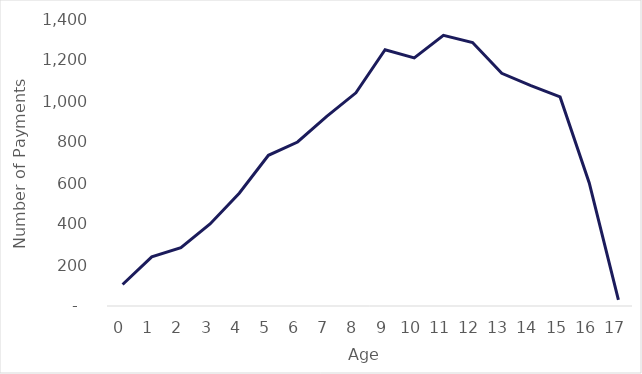
| Category | Number of Payments |
|---|---|
| 0.0 | 105 |
| 1.0 | 240 |
| 2.0 | 285 |
| 3.0 | 400 |
| 4.0 | 550 |
| 5.0 | 735 |
| 6.0 | 800 |
| 7.0 | 925 |
| 8.0 | 1040 |
| 9.0 | 1250 |
| 10.0 | 1210 |
| 11.0 | 1320 |
| 12.0 | 1285 |
| 13.0 | 1135 |
| 14.0 | 1075 |
| 15.0 | 1020 |
| 16.0 | 600 |
| 17.0 | 30 |